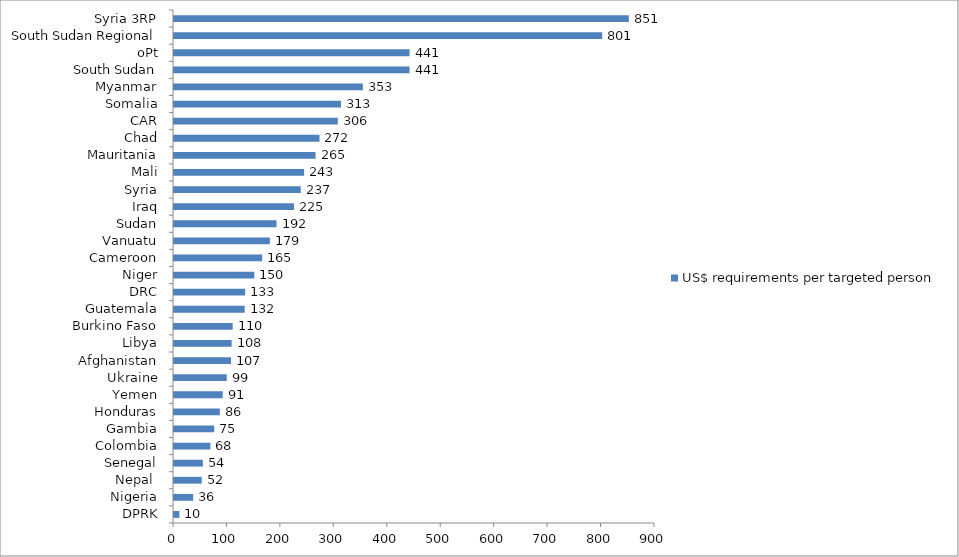
| Category | US$ requirements per targeted person |
|---|---|
| DPRK | 10.081 |
| Nigeria | 35.808 |
| Nepal  | 51.899 |
| Senegal | 54.025 |
| Colombia | 68.05 |
| Gambia | 75.319 |
| Honduras | 85.714 |
| Yemen | 91.161 |
| Ukraine | 98.75 |
| Afghanistan | 106.684 |
| Libya | 107.873 |
| Burkino Faso | 109.735 |
| Guatemala | 132.259 |
| DRC | 133.077 |
| Niger | 150.288 |
| Cameroon | 165.015 |
| Vanuatu | 179.338 |
| Sudan | 191.832 |
| Iraq | 224.575 |
| Syria | 237.168 |
| Mali | 243.472 |
| Mauritania | 264.916 |
| Chad | 272.189 |
| CAR | 306.479 |
| Somalia | 312.529 |
| Myanmar | 353.365 |
| South Sudan | 440.749 |
| oPt | 440.805 |
| South Sudan Regional | 801.211 |
| Syria 3RP | 851.052 |